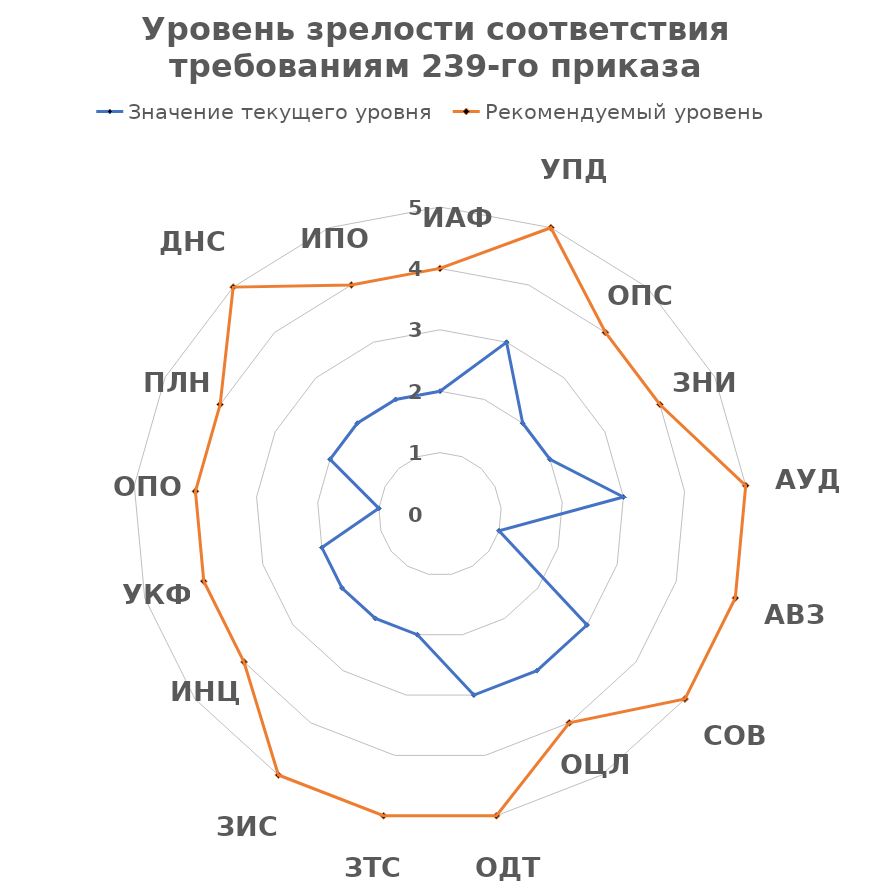
| Category | Значение текущего уровня | Рекомендуемый уровень |
|---|---|---|
| 0 | 2 | 4 |
| 1 | 3 | 5 |
| 2 | 2 | 4 |
| 3 | 2 | 4 |
| 4 | 3 | 5 |
| 5 | 1 | 5 |
| 6 | 3 | 5 |
| 7 | 3 | 4 |
| 8 | 3 | 5 |
| 9 | 2 | 5 |
| 10 | 2 | 5 |
| 11 | 2 | 4 |
| 12 | 2 | 4 |
| 13 | 1 | 4 |
| 14 | 2 | 4 |
| 15 | 2 | 5 |
| 16 | 2 | 4 |